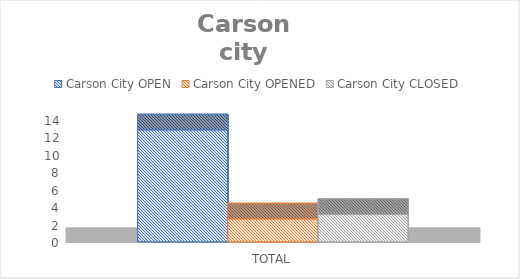
| Category | Carson City |
|---|---|
| TOTAL | 3.147 |